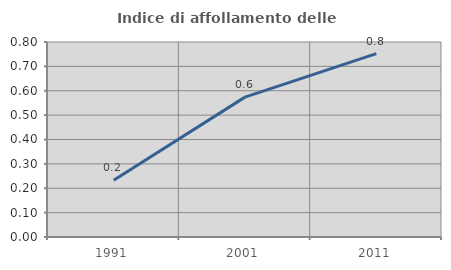
| Category | Indice di affollamento delle abitazioni  |
|---|---|
| 1991.0 | 0.233 |
| 2001.0 | 0.574 |
| 2011.0 | 0.752 |